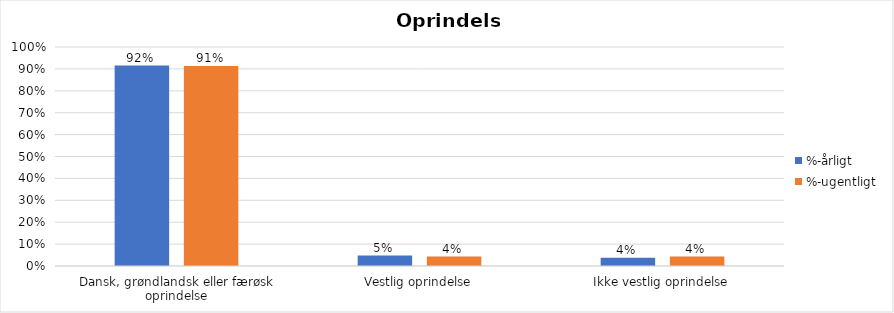
| Category | %-årligt | %-ugentligt |
|---|---|---|
| Dansk, grøndlandsk eller færøsk oprindelse | 0.915 | 0.914 |
| Vestlig oprindelse | 0.048 | 0.043 |
| Ikke vestlig oprindelse | 0.037 | 0.043 |